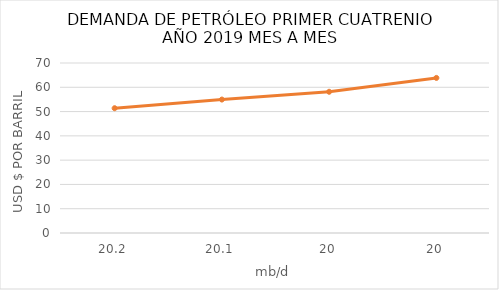
| Category | MILLONES DE BARRILES AL DÍA |
|---|---|
| 20.2 | 51.38 |
| 20.1 | 54.95 |
| 20.0 | 58.15 |
| 20.0 | 63.86 |